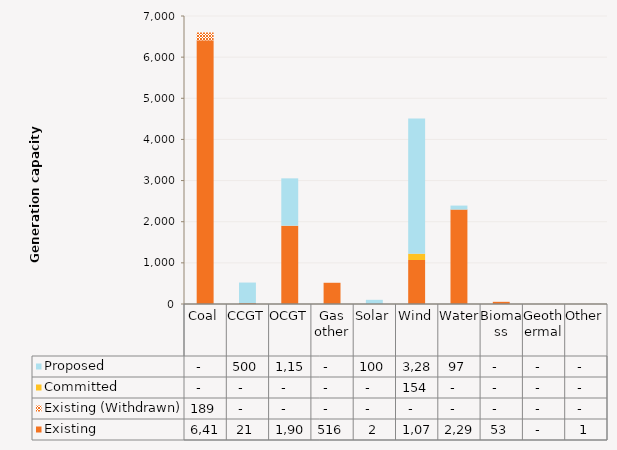
| Category | Existing | Existing (Withdrawn) | Committed | Proposed |
|---|---|---|---|---|
| Coal | 6410 | 189 | 0 | 0 |
| CCGT | 21 | 0 | 0 | 500 |
| OCGT | 1903.8 | 0 | 0 | 1150 |
| Gas other | 516 | 0 | 0 | 0 |
| Solar | 1.5 | 0 | 0 | 100 |
| Wind | 1069.7 | 0 | 153.8 | 3287.4 |
| Water | 2295.6 | 0 | 0 | 96.5 |
| Biomass | 53 | 0 | 0 | 0 |
| Geothermal | 0 | 0 | 0 | 0 |
| Other | 0.78 | 0 | 0 | 0 |